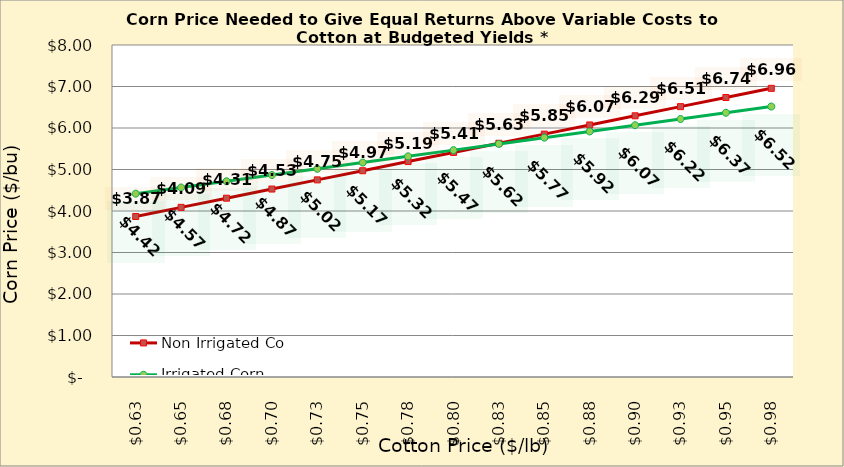
| Category | Non Irrigated Corn | Irrigated Corn |
|---|---|---|
| 0.6249999999999999 | 3.867 | 4.417 |
| 0.6499999999999999 | 4.088 | 4.567 |
| 0.6749999999999999 | 4.309 | 4.717 |
| 0.7 | 4.529 | 4.867 |
| 0.725 | 4.75 | 5.017 |
| 0.75 | 4.97 | 5.167 |
| 0.775 | 5.191 | 5.317 |
| 0.8 | 5.411 | 5.467 |
| 0.8250000000000001 | 5.632 | 5.617 |
| 0.8500000000000001 | 5.853 | 5.767 |
| 0.8750000000000001 | 6.073 | 5.917 |
| 0.9000000000000001 | 6.294 | 6.067 |
| 0.9250000000000002 | 6.514 | 6.217 |
| 0.9500000000000002 | 6.735 | 6.367 |
| 0.9750000000000002 | 6.956 | 6.517 |